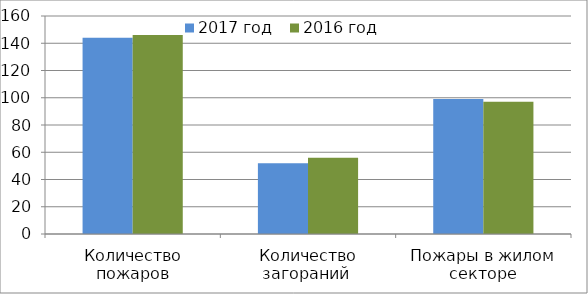
| Category | 2017 год | 2016 год |
|---|---|---|
| Количество пожаров | 144 | 146 |
| Количество загораний  | 52 | 56 |
| Пожары в жилом секторе | 99 | 97 |